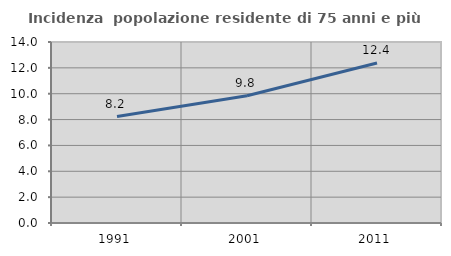
| Category | Incidenza  popolazione residente di 75 anni e più |
|---|---|
| 1991.0 | 8.237 |
| 2001.0 | 9.848 |
| 2011.0 | 12.378 |